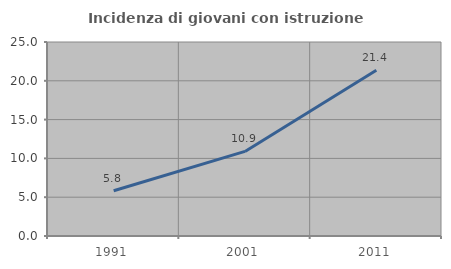
| Category | Incidenza di giovani con istruzione universitaria |
|---|---|
| 1991.0 | 5.83 |
| 2001.0 | 10.899 |
| 2011.0 | 21.362 |